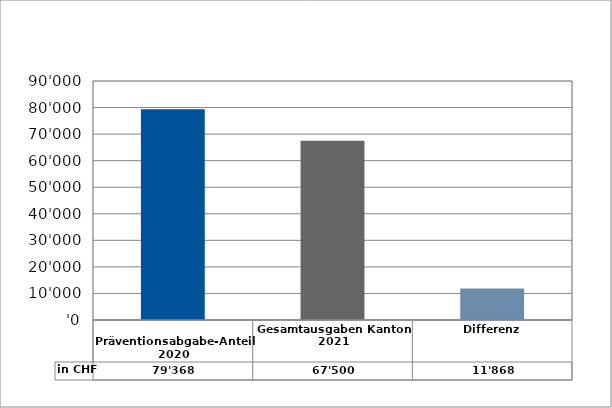
| Category | in CHF |
|---|---|
| 
Präventionsabgabe-Anteil 2020

 | 79368.3 |
| Gesamtausgaben Kanton 2021
 | 67500 |
| Differenz | 11868.3 |